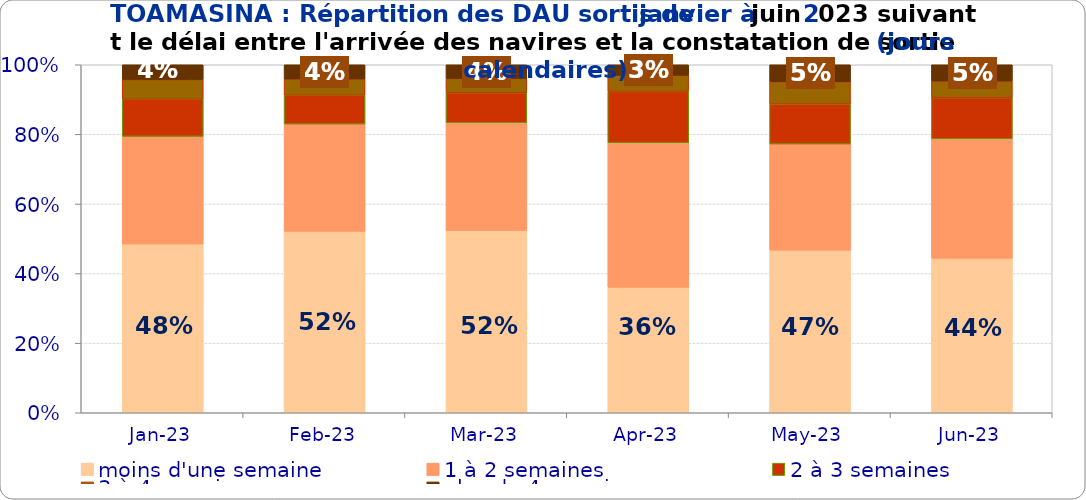
| Category | moins d'une semaine | 1 à 2 semaines | 2 à 3 semaines | 3 à 4 semaines | plus de 4 semaines |
|---|---|---|---|---|---|
| 2023-01-01 | 0.485 | 0.31 | 0.107 | 0.057 | 0.042 |
| 2023-02-01 | 0.521 | 0.309 | 0.083 | 0.047 | 0.041 |
| 2023-03-01 | 0.524 | 0.309 | 0.086 | 0.041 | 0.039 |
| 2023-04-01 | 0.361 | 0.415 | 0.147 | 0.046 | 0.03 |
| 2023-05-01 | 0.467 | 0.305 | 0.115 | 0.064 | 0.049 |
| 2023-06-01 | 0.444 | 0.343 | 0.118 | 0.048 | 0.047 |